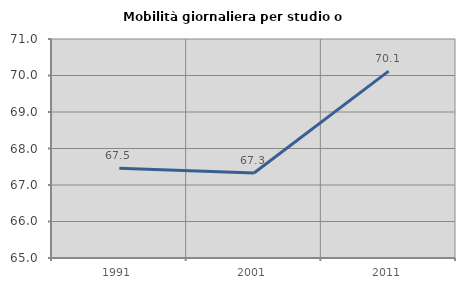
| Category | Mobilità giornaliera per studio o lavoro |
|---|---|
| 1991.0 | 67.459 |
| 2001.0 | 67.327 |
| 2011.0 | 70.121 |